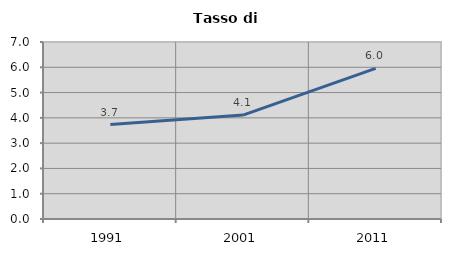
| Category | Tasso di disoccupazione   |
|---|---|
| 1991.0 | 3.734 |
| 2001.0 | 4.11 |
| 2011.0 | 5.956 |